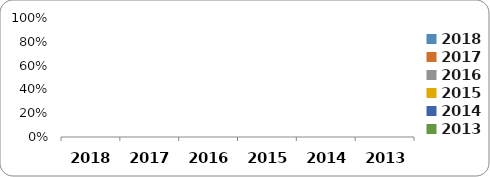
| Category | Series 0 |
|---|---|
| 2018.0 | 0 |
| 2017.0 | 0 |
| 2016.0 | 0 |
| 2015.0 | 0 |
| 2014.0 | 0 |
| 2013.0 | 0 |